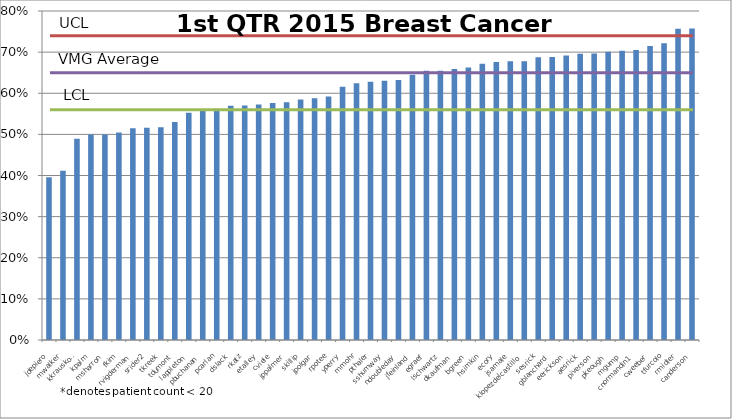
| Category | Series 0 |
|---|---|
| jdepiero | 0.396 |
| mwalker | 0.412 |
| kkrauskopf | 0.489 |
| kpalm | 0.5 |
| msharron | 0.5 |
| fkim | 0.505 |
| rvigderman | 0.515 |
| srider2 | 0.516 |
| tkreek | 0.517 |
| tdumont | 0.53 |
| lappleton | 0.552 |
| pbuchanan | 0.558 |
| pcarlan | 0.562 |
| dslack | 0.569 |
| rkatz | 0.57 |
| etalley | 0.573 |
| cviele | 0.576 |
| jppalmer | 0.578 |
| skillip | 0.585 |
| jpolgar | 0.588 |
| rpotee | 0.592 |
| yperry | 0.616 |
| mmohr | 0.624 |
| pthaler | 0.628 |
| sshumway | 0.63 |
| ndoubleday | 0.632 |
| jfeinland | 0.645 |
| egraef | 0.655 |
| lschwartz | 0.655 |
| dkaufman | 0.659 |
| bgreen | 0.663 |
| hsimkin | 0.672 |
| ecory | 0.676 |
| jsamale | 0.678 |
| klopezdelcastillo | 0.678 |
| sesrick | 0.688 |
| gblanchard | 0.688 |
| eerickson | 0.692 |
| aesrick | 0.696 |
| piverson | 0.697 |
| pkeough | 0.701 |
| mgump | 0.703 |
| cnormandin1 | 0.705 |
| cweeber | 0.715 |
| tfurcolo | 0.722 |
| rmidler | 0.757 |
| canderson | 0.758 |